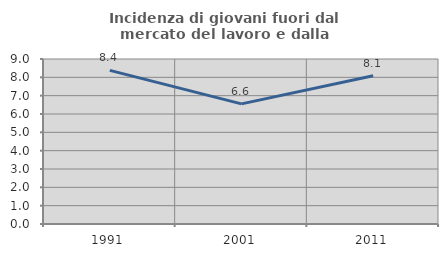
| Category | Incidenza di giovani fuori dal mercato del lavoro e dalla formazione  |
|---|---|
| 1991.0 | 8.377 |
| 2001.0 | 6.552 |
| 2011.0 | 8.082 |